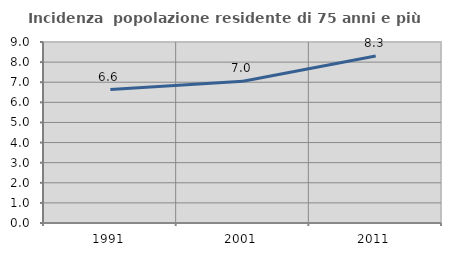
| Category | Incidenza  popolazione residente di 75 anni e più |
|---|---|
| 1991.0 | 6.635 |
| 2001.0 | 7.045 |
| 2011.0 | 8.3 |